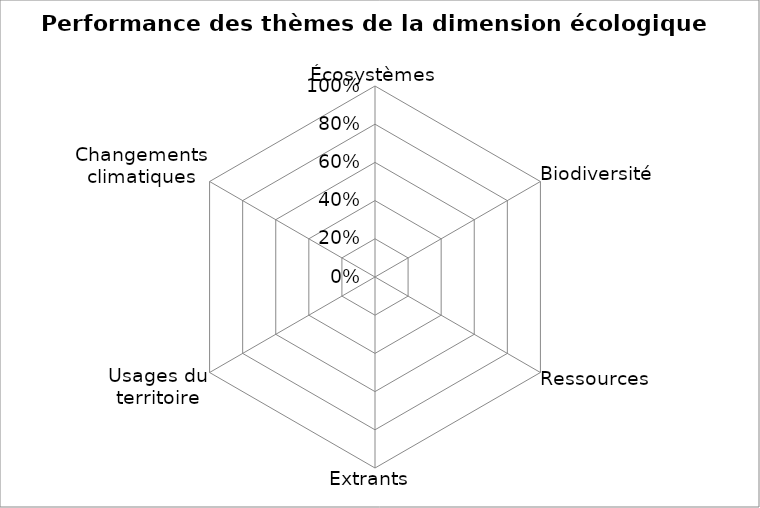
| Category | Series 0 |
|---|---|
| Écosystèmes | 0 |
| Biodiversité | 0 |
| Ressources | 0 |
| Extrants  | 0 |
| Usages du territoire | 0 |
| Changements climatiques | 0 |